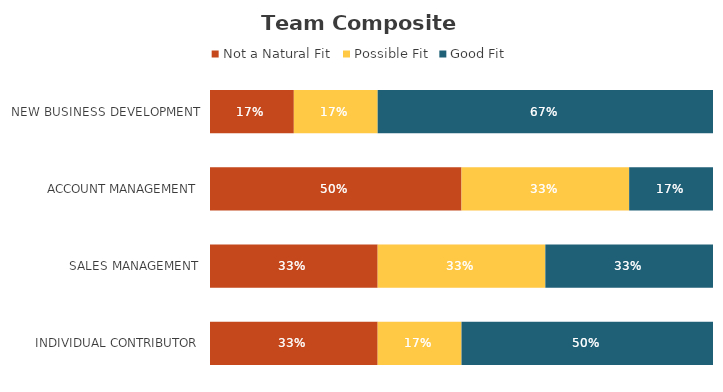
| Category | Not a Natural Fit | Possible Fit | Good Fit |
|---|---|---|---|
| NEW BUSINESS DEVELOPMENT | 0.167 | 0.167 | 0.667 |
| ACCOUNT MANAGEMENT | 0.5 | 0.333 | 0.167 |
| SALES MANAGEMENT | 0.333 | 0.333 | 0.333 |
| INDIVIDUAL CONTRIBUTOR | 0.333 | 0.167 | 0.5 |